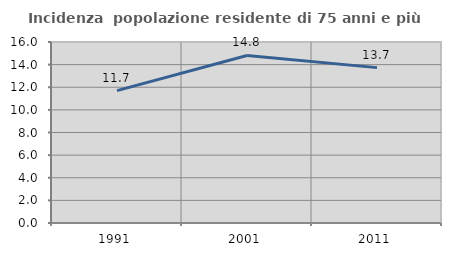
| Category | Incidenza  popolazione residente di 75 anni e più |
|---|---|
| 1991.0 | 11.699 |
| 2001.0 | 14.81 |
| 2011.0 | 13.735 |